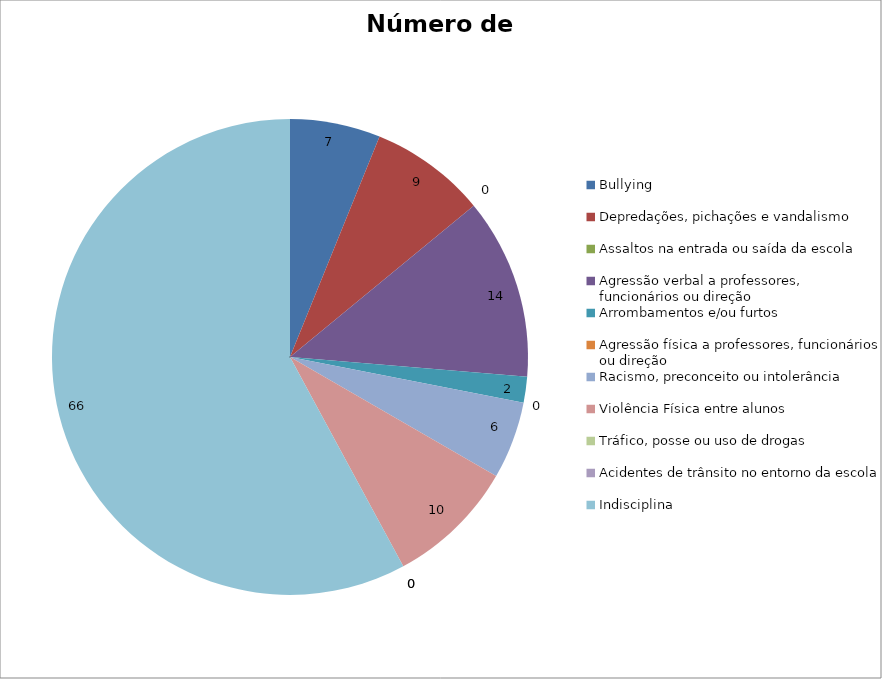
| Category | Número de Casos |
|---|---|
| Bullying | 7 |
| Depredações, pichações e vandalismo | 9 |
| Assaltos na entrada ou saída da escola | 0 |
| Agressão verbal a professores, funcionários ou direção | 14 |
| Arrombamentos e/ou furtos | 2 |
| Agressão física a professores, funcionários ou direção | 0 |
| Racismo, preconceito ou intolerância | 6 |
| Violência Física entre alunos | 10 |
| Tráfico, posse ou uso de drogas | 0 |
| Acidentes de trânsito no entorno da escola | 0 |
| Indisciplina | 66 |